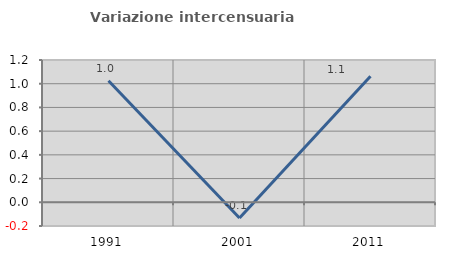
| Category | Variazione intercensuaria annua |
|---|---|
| 1991.0 | 1.025 |
| 2001.0 | -0.133 |
| 2011.0 | 1.064 |